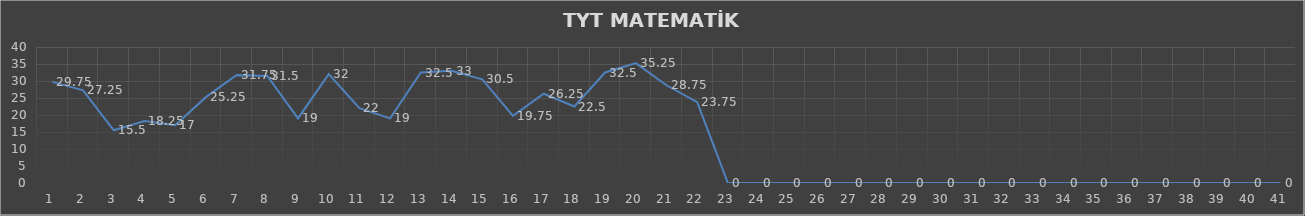
| Category | Series 0 |
|---|---|
| 0 | 29.75 |
| 1 | 27.25 |
| 2 | 15.5 |
| 3 | 18.25 |
| 4 | 17 |
| 5 | 25.25 |
| 6 | 31.75 |
| 7 | 31.5 |
| 8 | 19 |
| 9 | 32 |
| 10 | 22 |
| 11 | 19 |
| 12 | 32.5 |
| 13 | 33 |
| 14 | 30.5 |
| 15 | 19.75 |
| 16 | 26.25 |
| 17 | 22.5 |
| 18 | 32.5 |
| 19 | 35.25 |
| 20 | 28.75 |
| 21 | 23.75 |
| 22 | 0 |
| 23 | 0 |
| 24 | 0 |
| 25 | 0 |
| 26 | 0 |
| 27 | 0 |
| 28 | 0 |
| 29 | 0 |
| 30 | 0 |
| 31 | 0 |
| 32 | 0 |
| 33 | 0 |
| 34 | 0 |
| 35 | 0 |
| 36 | 0 |
| 37 | 0 |
| 38 | 0 |
| 39 | 0 |
| 40 | 0 |